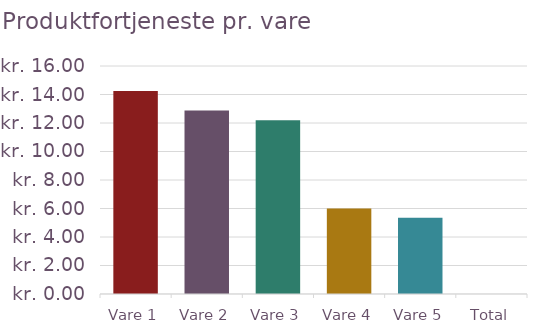
| Category | Fortjeneste pr. vare 
(inkl. forsendelse) |
|---|---|
| Vare 1 | 14.25 |
| Vare 2 | 12.875 |
| Vare 3 | 12.2 |
| Vare 4 | 6 |
| Vare 5 | 5.35 |